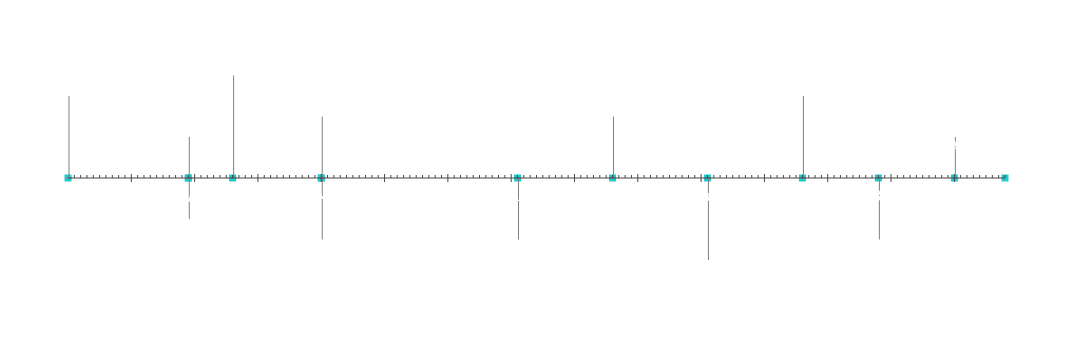
| Category | Position |
|---|---|
| Projektstart | 20 |
| Milstolpe 1 | 10 |
| Milstolpe 2 | -10 |
| Milstolpe 3 | 25 |
| Milstolpe 4 | -15 |
| Milstolpe 5 | 15 |
| Milstolpe 6 | -15 |
| Milstolpe 7 | 15 |
| Milstolpe 8 | -20 |
| Milstolpe 9 | 20 |
| Milstolpe 10 | -15 |
| Milstolpe 11 | 10 |
| Projektslut | 5 |